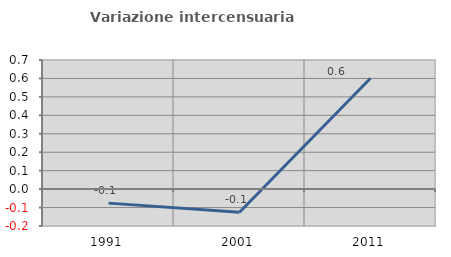
| Category | Variazione intercensuaria annua |
|---|---|
| 1991.0 | -0.076 |
| 2001.0 | -0.126 |
| 2011.0 | 0.601 |